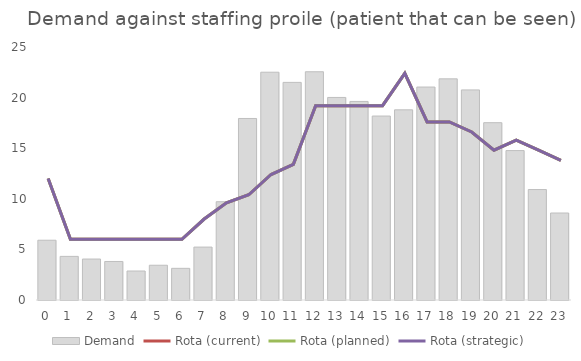
| Category | Demand |
|---|---|
| 0.0 | 5.906 |
| 1.0 | 4.309 |
| 2.0 | 4.047 |
| 3.0 | 3.806 |
| 4.0 | 2.866 |
| 5.0 | 3.434 |
| 6.0 | 3.128 |
| 7.0 | 5.228 |
| 8.0 | 9.712 |
| 9.0 | 17.937 |
| 10.0 | 22.509 |
| 11.0 | 21.503 |
| 12.0 | 22.553 |
| 13.0 | 20.015 |
| 14.0 | 19.622 |
| 15.0 | 18.178 |
| 16.0 | 18.79 |
| 17.0 | 21.044 |
| 18.0 | 21.853 |
| 19.0 | 20.759 |
| 20.0 | 17.522 |
| 21.0 | 14.765 |
| 22.0 | 10.916 |
| 23.0 | 8.597 |